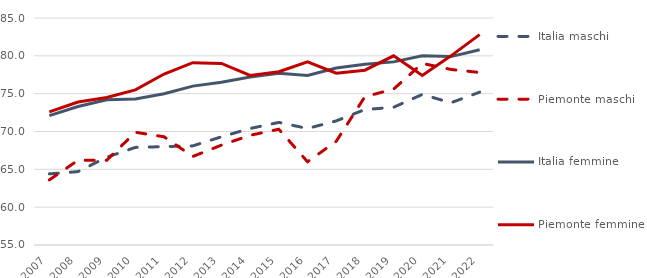
| Category | Italia maschi | Piemonte maschi | Italia femmine | Piemonte femmine |
|---|---|---|---|---|
| 2007 | 64.4 | 63.6 | 72.1 | 72.6 |
| 2008 | 64.7 | 66.2 | 73.3 | 73.9 |
| 2009 | 66.6 | 66.2 | 74.2 | 74.5 |
| 2010 | 67.9 | 69.9 | 74.3 | 75.5 |
| 2011 | 68 | 69.3 | 75 | 77.6 |
| 2012 | 68.1 | 66.7 | 76 | 79.1 |
| 2013 | 69.3 | 68.2 | 76.5 | 79 |
| 2014 | 70.4 | 69.5 | 77.2 | 77.4 |
| 2015 | 71.2 | 70.3 | 77.7 | 77.9 |
| 2016 | 70.4 | 66 | 77.4 | 79.2 |
| 2017 | 71.4 | 68.7 | 78.4 | 77.7 |
| 2018 | 72.9 | 74.6 | 78.9 | 78.1 |
| 2019 | 73.2 | 75.6 | 79.2 | 80 |
| 2020 | 74.9 | 79 | 80 | 77.4 |
| 2021 | 73.8 | 78.2 | 79.9 | 80 |
| 2022 | 75.2 | 77.8 | 80.8 | 82.8 |